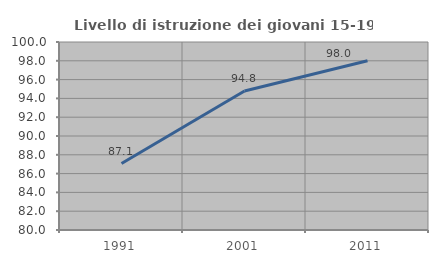
| Category | Livello di istruzione dei giovani 15-19 anni |
|---|---|
| 1991.0 | 87.068 |
| 2001.0 | 94.788 |
| 2011.0 | 97.997 |